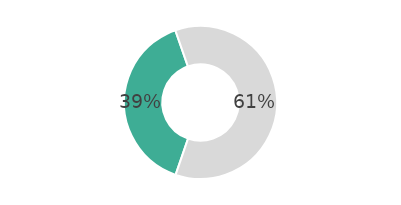
| Category | Series 0 |
|---|---|
| 0 | 39.384 |
| 1 | 60.616 |